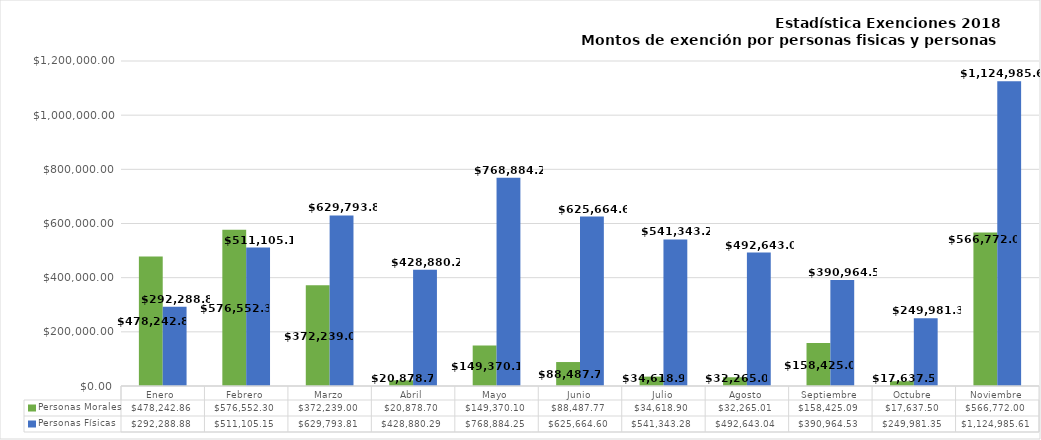
| Category | Personas Morales | Personas Físicas |
|---|---|---|
| Enero  | 478242.86 | 292288.88 |
| Febrero | 576552.3 | 511105.15 |
| Marzo | 372239 | 629793.81 |
| Abril | 20878.7 | 428880.29 |
| Mayo | 149370.1 | 768884.25 |
| Junio | 88487.77 | 625664.6 |
| Julio | 34618.9 | 541343.28 |
| Agosto | 32265.01 | 492643.04 |
| Septiembre | 158425.09 | 390964.53 |
| Octubre | 17637.5 | 249981.35 |
| Noviembre | 566772 | 1124985.61 |